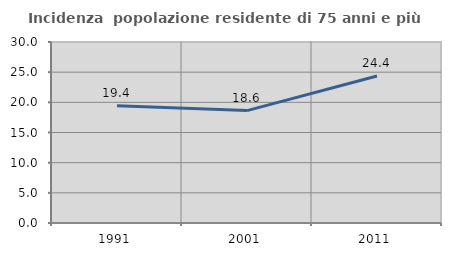
| Category | Incidenza  popolazione residente di 75 anni e più |
|---|---|
| 1991.0 | 19.414 |
| 2001.0 | 18.631 |
| 2011.0 | 24.359 |